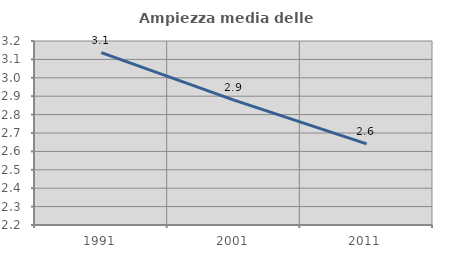
| Category | Ampiezza media delle famiglie |
|---|---|
| 1991.0 | 3.137 |
| 2001.0 | 2.879 |
| 2011.0 | 2.641 |